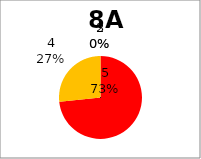
| Category | Series 0 |
|---|---|
| 5.0 | 11 |
| 4.0 | 4 |
| 3.0 | 0 |
| 2.0 | 0 |